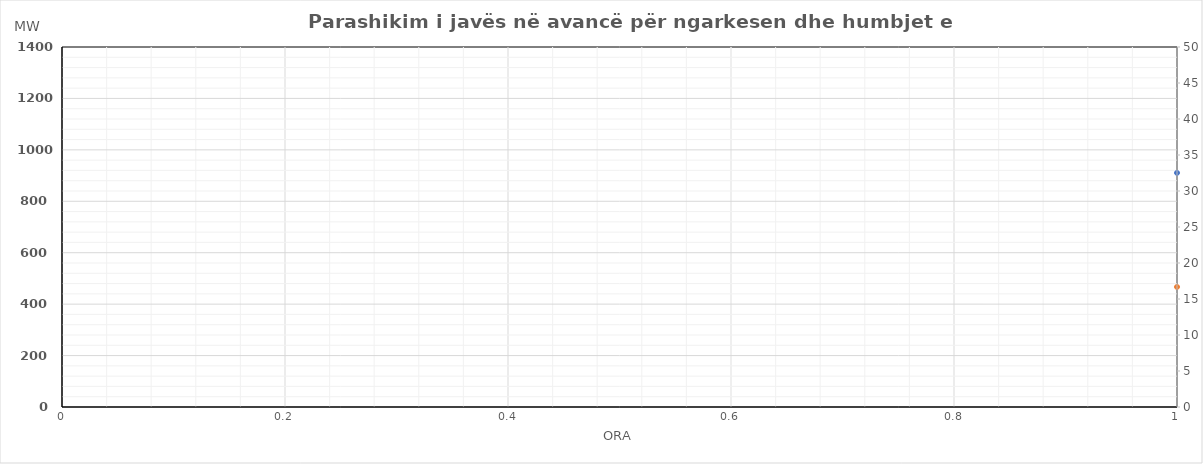
| Category | Ngarkesa (MWh) |
|---|---|
| 0 | 466.95 |
| 1 | 419.82 |
| 2 | 413.1 |
| 3 | 410.95 |
| 4 | 410.71 |
| 5 | 468.32 |
| 6 | 757.45 |
| 7 | 924.84 |
| 8 | 977.94 |
| 9 | 980.94 |
| 10 | 901 |
| 11 | 882.8 |
| 12 | 831.78 |
| 13 | 774.97 |
| 14 | 769.37 |
| 15 | 915.46 |
| 16 | 1076.51 |
| 17 | 1197.65 |
| 18 | 1192.54 |
| 19 | 1166.95 |
| 20 | 1119.79 |
| 21 | 949.06 |
| 22 | 708.58 |
| 23 | 495.94 |
| 24 | 483.45 |
| 25 | 437.14 |
| 26 | 423.6 |
| 27 | 418.6 |
| 28 | 421.6 |
| 29 | 490.32 |
| 30 | 734.02 |
| 31 | 927.96 |
| 32 | 951.66 |
| 33 | 914.82 |
| 34 | 794.15 |
| 35 | 771.74 |
| 36 | 764.43 |
| 37 | 794.42 |
| 38 | 878.08 |
| 39 | 974.48 |
| 40 | 1192.7 |
| 41 | 1311.81 |
| 42 | 1306.14 |
| 43 | 1246.16 |
| 44 | 1124.4 |
| 45 | 890.62 |
| 46 | 752.41 |
| 47 | 573.27 |
| 48 | 465.65 |
| 49 | 416.3 |
| 50 | 409.3 |
| 51 | 411 |
| 52 | 410.3 |
| 53 | 455.52 |
| 54 | 563.48 |
| 55 | 873.82 |
| 56 | 959.49 |
| 57 | 998.09 |
| 58 | 894.17 |
| 59 | 869.09 |
| 60 | 864.7 |
| 61 | 899.33 |
| 62 | 876.05 |
| 63 | 1011.3 |
| 64 | 1157.97 |
| 65 | 1235.52 |
| 66 | 1242.26 |
| 67 | 1210.35 |
| 68 | 1163.7 |
| 69 | 901.73 |
| 70 | 740.96 |
| 71 | 591.62 |
| 72 | 451.4 |
| 73 | 398 |
| 74 | 392 |
| 75 | 395.5 |
| 76 | 396.8 |
| 77 | 454.22 |
| 78 | 630.17 |
| 79 | 937.32 |
| 80 | 1021.05 |
| 81 | 995.03 |
| 82 | 994.03 |
| 83 | 996.29 |
| 84 | 889.26 |
| 85 | 910.22 |
| 86 | 1044.44 |
| 87 | 1065.77 |
| 88 | 1138.62 |
| 89 | 1212.44 |
| 90 | 1210.28 |
| 91 | 1184.82 |
| 92 | 1147.19 |
| 93 | 1054.16 |
| 94 | 769.33 |
| 95 | 595.37 |
| 96 | 486.87 |
| 97 | 412.2 |
| 98 | 397 |
| 99 | 399 |
| 100 | 399 |
| 101 | 463.4 |
| 102 | 810.39 |
| 103 | 999.68 |
| 104 | 1099.76 |
| 105 | 1125.34 |
| 106 | 1112.62 |
| 107 | 937.84 |
| 108 | 926.92 |
| 109 | 982.58 |
| 110 | 993.78 |
| 111 | 1138.9 |
| 112 | 1173.76 |
| 113 | 1254.96 |
| 114 | 1250.99 |
| 115 | 1228.94 |
| 116 | 1186.92 |
| 117 | 877.5 |
| 118 | 749.63 |
| 119 | 616.1 |
| 120 | 519.3 |
| 121 | 430.65 |
| 122 | 415 |
| 123 | 413 |
| 124 | 409 |
| 125 | 455.51 |
| 126 | 433.31 |
| 127 | 591.83 |
| 128 | 780.37 |
| 129 | 905.57 |
| 130 | 913.85 |
| 131 | 911.9 |
| 132 | 843.37 |
| 133 | 872.34 |
| 134 | 904.88 |
| 135 | 904.57 |
| 136 | 1050.9 |
| 137 | 1183.85 |
| 138 | 1161.81 |
| 139 | 1180.49 |
| 140 | 965.3 |
| 141 | 871.21 |
| 142 | 759.47 |
| 143 | 591.53 |
| 144 | 538.86 |
| 145 | 479.3 |
| 146 | 418.3 |
| 147 | 413.5 |
| 148 | 410.24 |
| 149 | 437.54 |
| 150 | 442.53 |
| 151 | 593.3 |
| 152 | 784.81 |
| 153 | 869.21 |
| 154 | 876.65 |
| 155 | 790.73 |
| 156 | 799.41 |
| 157 | 778.13 |
| 158 | 791.21 |
| 159 | 866.32 |
| 160 | 989.4 |
| 161 | 1128.97 |
| 162 | 1125.6 |
| 163 | 1102.13 |
| 164 | 987.16 |
| 165 | 882.19 |
| 166 | 757.61 |
| 167 | 629.78 |